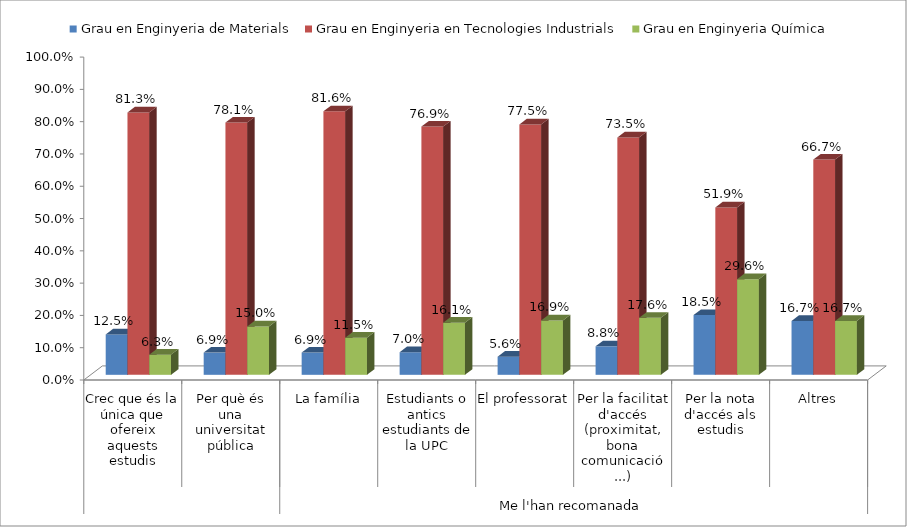
| Category | Grau en Enginyeria de Materials | Grau en Enginyeria en Tecnologies Industrials | Grau en Enginyeria Química |
|---|---|---|---|
| 0 | 0.125 | 0.812 | 0.062 |
| 1 | 0.069 | 0.781 | 0.15 |
| 2 | 0.069 | 0.816 | 0.115 |
| 3 | 0.07 | 0.769 | 0.161 |
| 4 | 0.056 | 0.775 | 0.169 |
| 5 | 0.088 | 0.735 | 0.176 |
| 6 | 0.185 | 0.519 | 0.296 |
| 7 | 0.167 | 0.667 | 0.167 |